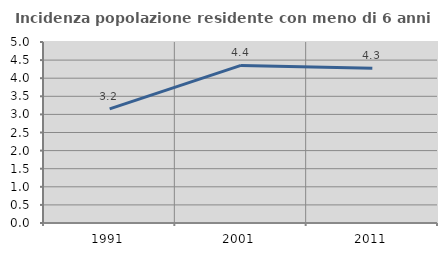
| Category | Incidenza popolazione residente con meno di 6 anni |
|---|---|
| 1991.0 | 3.154 |
| 2001.0 | 4.353 |
| 2011.0 | 4.276 |